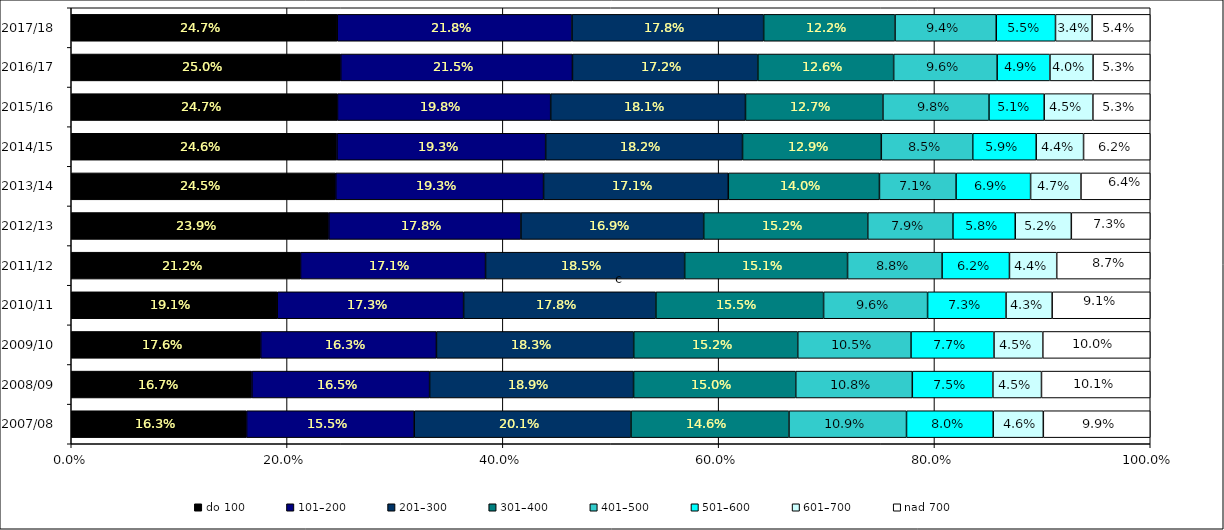
| Category | do 100 | 101–200 | 201–300 | 301–400 | 401–500 | 501–600 | 601–700 | nad 700 |
|---|---|---|---|---|---|---|---|---|
| 2007/08 | 0.162 | 0.155 | 0.201 | 0.146 | 0.109 | 0.08 | 0.046 | 0.099 |
| 2008/09 | 0.167 | 0.165 | 0.189 | 0.15 | 0.108 | 0.075 | 0.045 | 0.101 |
| 2009/10 | 0.176 | 0.163 | 0.183 | 0.152 | 0.105 | 0.077 | 0.045 | 0.1 |
| 2010/11 | 0.191 | 0.173 | 0.178 | 0.155 | 0.096 | 0.073 | 0.043 | 0.091 |
| 2011/12 | 0.212 | 0.171 | 0.185 | 0.151 | 0.088 | 0.062 | 0.044 | 0.087 |
| 2012/13 | 0.239 | 0.178 | 0.169 | 0.152 | 0.079 | 0.058 | 0.052 | 0.073 |
| 2013/14 | 0.245 | 0.193 | 0.171 | 0.14 | 0.071 | 0.069 | 0.047 | 0.064 |
| 2014/15 | 0.246 | 0.193 | 0.182 | 0.129 | 0.085 | 0.059 | 0.044 | 0.062 |
| 2015/16 | 0.247 | 0.198 | 0.181 | 0.127 | 0.098 | 0.051 | 0.045 | 0.053 |
| 2016/17 | 0.25 | 0.215 | 0.172 | 0.126 | 0.096 | 0.049 | 0.04 | 0.053 |
| 2017/18 | 0.247 | 0.218 | 0.178 | 0.122 | 0.094 | 0.055 | 0.034 | 0.054 |